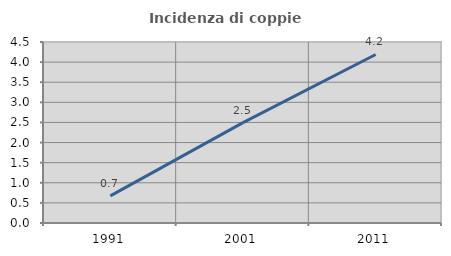
| Category | Incidenza di coppie miste |
|---|---|
| 1991.0 | 0.675 |
| 2001.0 | 2.495 |
| 2011.0 | 4.189 |